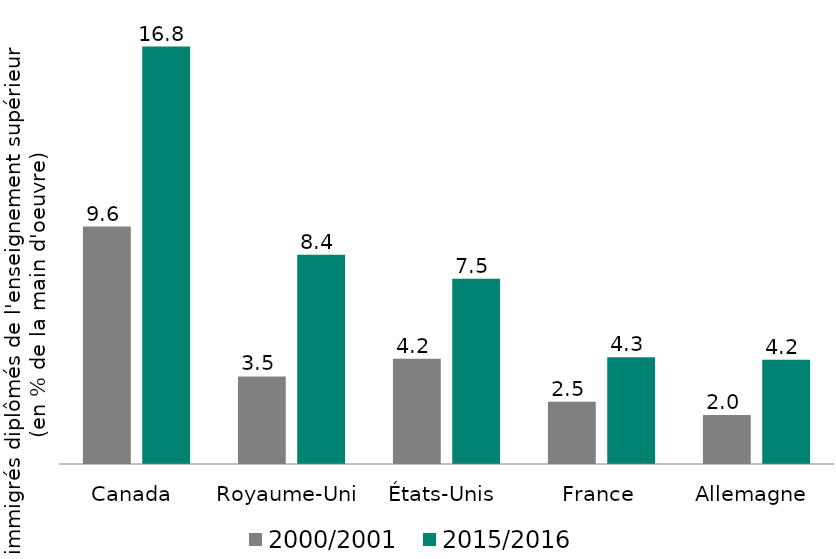
| Category | 2000/2001 | 2015/2016 |
|---|---|---|
| Canada | 9.563 | 16.808 |
| Royaume-Uni | 3.527 | 8.423 |
| États-Unis | 4.234 | 7.461 |
| France | 2.506 | 4.301 |
| Allemagne | 1.971 | 4.196 |